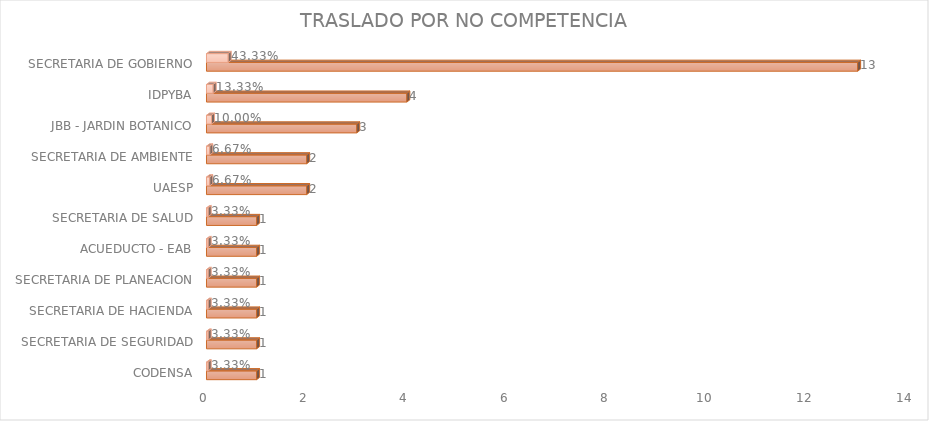
| Category | Cuenta de Número petición | Cuenta de Número petición2 |
|---|---|---|
| CODENSA | 1 | 0.033 |
| SECRETARIA DE SEGURIDAD | 1 | 0.033 |
| SECRETARIA DE HACIENDA | 1 | 0.033 |
| SECRETARIA DE PLANEACION | 1 | 0.033 |
| ACUEDUCTO - EAB | 1 | 0.033 |
| SECRETARIA DE SALUD | 1 | 0.033 |
| UAESP | 2 | 0.067 |
| SECRETARIA DE AMBIENTE | 2 | 0.067 |
| JBB - JARDIN BOTANICO | 3 | 0.1 |
| IDPYBA | 4 | 0.133 |
| SECRETARIA DE GOBIERNO | 13 | 0.433 |